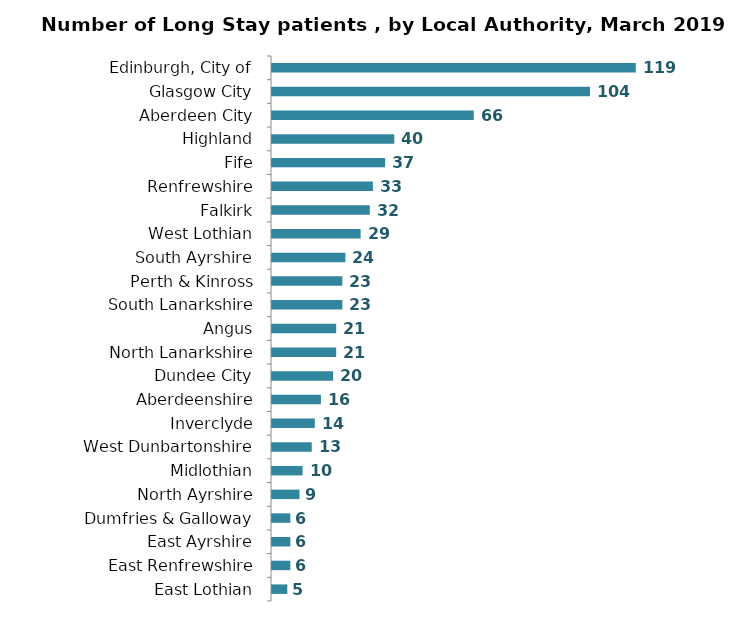
| Category | Series 0 |
|---|---|
| Edinburgh, City of | 119 |
| Glasgow City | 104 |
| Aberdeen City | 66 |
| Highland | 40 |
| Fife | 37 |
| Renfrewshire | 33 |
| Falkirk | 32 |
| West Lothian | 29 |
| South Ayrshire | 24 |
| Perth & Kinross | 23 |
| South Lanarkshire | 23 |
| Angus | 21 |
| North Lanarkshire | 21 |
| Dundee City | 20 |
| Aberdeenshire | 16 |
| Inverclyde | 14 |
| West Dunbartonshire | 13 |
| Midlothian | 10 |
| North Ayrshire | 9 |
| Dumfries & Galloway | 6 |
| East Ayrshire | 6 |
| East Renfrewshire | 6 |
| East Lothian | 5 |